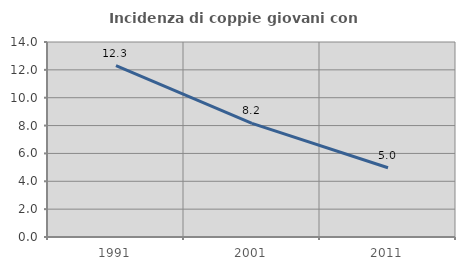
| Category | Incidenza di coppie giovani con figli |
|---|---|
| 1991.0 | 12.303 |
| 2001.0 | 8.153 |
| 2011.0 | 4.969 |